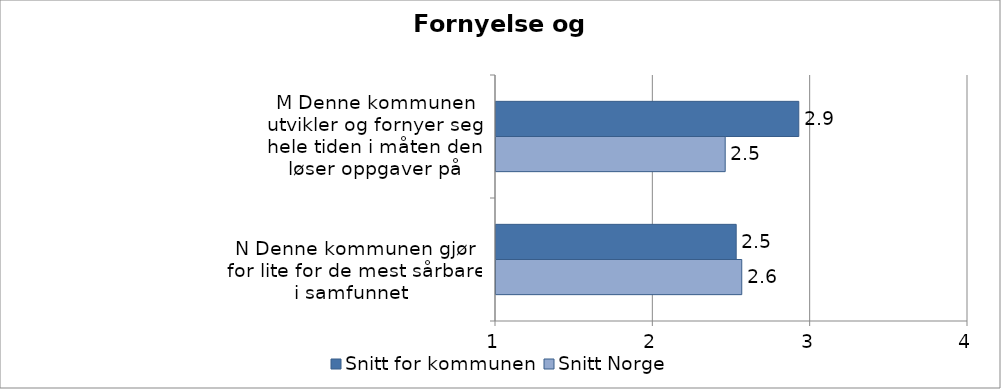
| Category | Snitt for kommunen | Snitt Norge |
|---|---|---|
| M Denne kommunen utvikler og fornyer seg hele tiden i måten den løser oppgaver på | 2.925 | 2.457 |
| 
N Denne kommunen gjør for lite for de mest sårbare i samfunnet  | 2.527 | 2.562 |